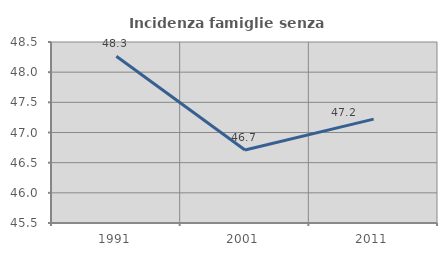
| Category | Incidenza famiglie senza nuclei |
|---|---|
| 1991.0 | 48.263 |
| 2001.0 | 46.711 |
| 2011.0 | 47.222 |